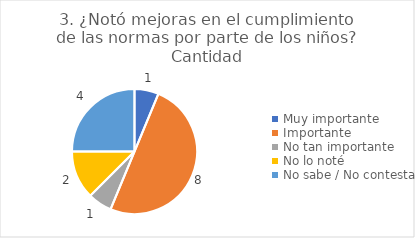
| Category | 3. ¿Notó mejoras en el cumplimiento de las normas por parte de los niños? |
|---|---|
| Muy importante  | 0.062 |
| Importante  | 0.5 |
| No tan importante  | 0.062 |
| No lo noté  | 0.125 |
| No sabe / No contesta | 0.25 |